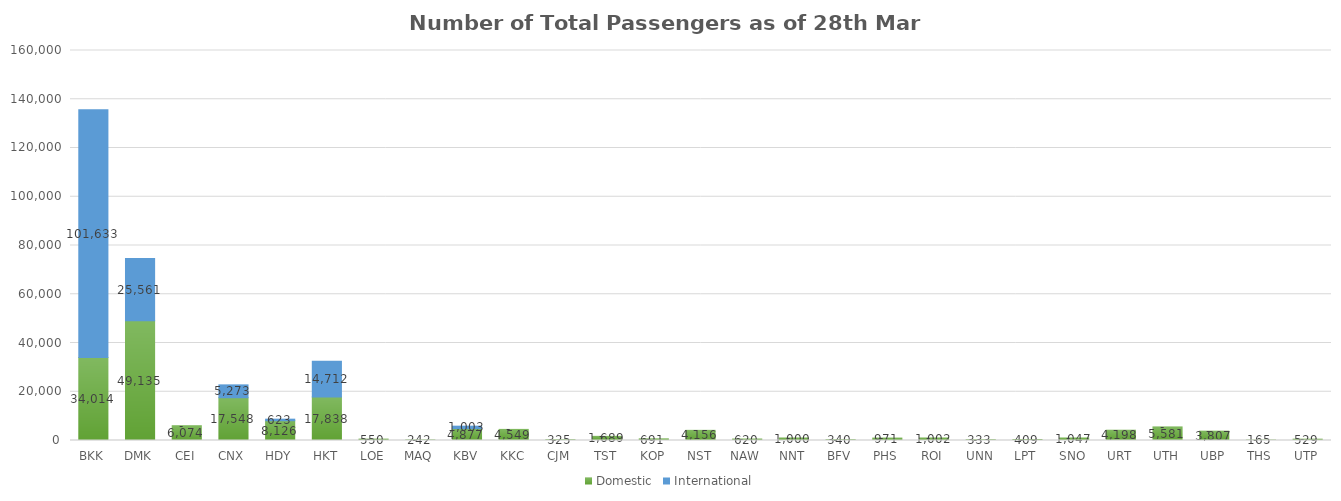
| Category | Domestic | International |
|---|---|---|
| BKK | 34014 | 101633 |
| DMK | 49135 | 25561 |
| CEI | 6074 | 0 |
| CNX | 17548 | 5273 |
| HDY | 8126 | 623 |
| HKT | 17838 | 14712 |
| LOE | 550 | 0 |
| MAQ | 242 | 0 |
| KBV | 4877 | 1003 |
| KKC | 4549 | 0 |
| CJM | 325 | 0 |
| TST | 1689 | 0 |
| KOP | 691 | 0 |
| NST | 4156 | 0 |
| NAW | 620 | 0 |
| NNT | 1000 | 0 |
| BFV | 340 | 0 |
| PHS | 971 | 0 |
| ROI | 1002 | 0 |
| UNN | 333 | 0 |
| LPT | 409 | 0 |
| SNO | 1047 | 0 |
| URT | 4198 | 0 |
| UTH | 5581 | 0 |
| UBP | 3807 | 0 |
| THS | 165 | 0 |
| UTP | 529 | 0 |